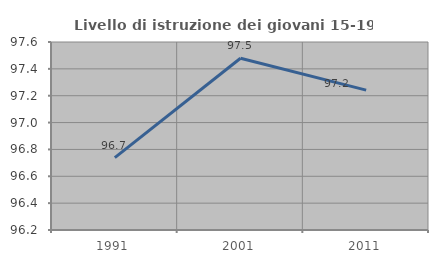
| Category | Livello di istruzione dei giovani 15-19 anni |
|---|---|
| 1991.0 | 96.739 |
| 2001.0 | 97.479 |
| 2011.0 | 97.241 |